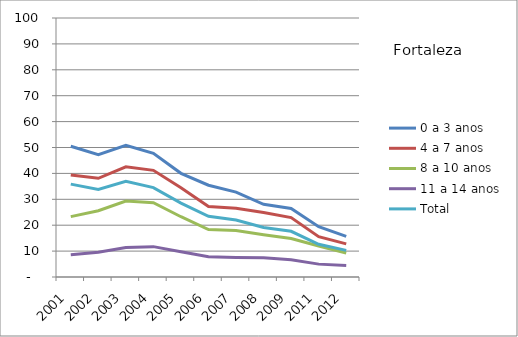
| Category | 0 a 3 anos | 4 a 7 anos | 8 a 10 anos | 11 a 14 anos | Total |
|---|---|---|---|---|---|
| 2001.0 | 50.46 | 39.38 | 23.32 | 8.59 | 35.86 |
| 2002.0 | 47.21 | 38.1 | 25.57 | 9.53 | 33.8 |
| 2003.0 | 50.84 | 42.54 | 29.3 | 11.37 | 36.95 |
| 2004.0 | 47.74 | 41.18 | 28.7 | 11.72 | 34.5 |
| 2005.0 | 40.03 | 34.5 | 23.27 | 9.74 | 28.52 |
| 2006.0 | 35.43 | 27.22 | 18.32 | 7.85 | 23.46 |
| 2007.0 | 32.76 | 26.56 | 17.94 | 7.55 | 22.03 |
| 2008.0 | 28.07 | 24.89 | 16.31 | 7.43 | 19.13 |
| 2009.0 | 26.44 | 22.92 | 14.89 | 6.7 | 17.65 |
| 2011.0 | 19.43 | 15.58 | 11.99 | 4.97 | 12.64 |
| 2012.0 | 15.71 | 12.78 | 9.28 | 4.47 | 10.27 |